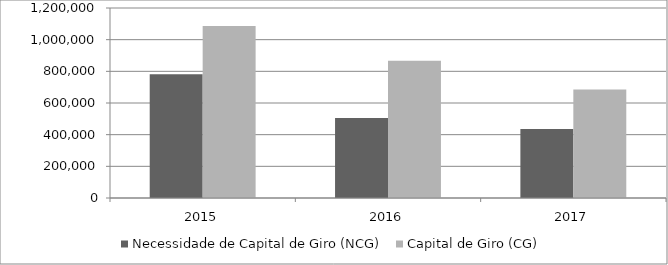
| Category | Necessidade de Capital de Giro (NCG) | Capital de Giro (CG) |
|---|---|---|
| 2015.0 | 782207 | 1085672 |
| 2016.0 | 505612 | 866147 |
| 2017.0 | 435521 | 686004 |